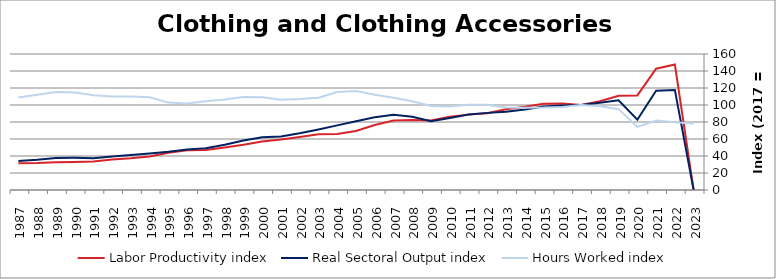
| Category | Labor Productivity index | Real Sectoral Output index | Hours Worked index |
|---|---|---|---|
| 2023.0 | 0 | 0 | 78.307 |
| 2022.0 | 147.592 | 117.741 | 79.774 |
| 2021.0 | 142.694 | 116.682 | 81.77 |
| 2020.0 | 111.298 | 82.657 | 74.267 |
| 2019.0 | 110.901 | 105.49 | 95.12 |
| 2018.0 | 104.315 | 102.765 | 98.514 |
| 2017.0 | 100 | 100 | 100 |
| 2016.0 | 101.866 | 99.522 | 97.7 |
| 2015.0 | 101.373 | 98.264 | 96.934 |
| 2014.0 | 97.892 | 94.781 | 96.822 |
| 2013.0 | 95.005 | 92.103 | 96.945 |
| 2012.0 | 90.392 | 90.735 | 100.379 |
| 2011.0 | 88.678 | 88.872 | 100.218 |
| 2010.0 | 86.266 | 84.789 | 98.288 |
| 2009.0 | 81.845 | 80.944 | 98.898 |
| 2008.0 | 82.485 | 86.153 | 104.447 |
| 2007.0 | 81.676 | 88.634 | 108.519 |
| 2006.0 | 76.404 | 85.61 | 112.05 |
| 2005.0 | 69.511 | 80.983 | 116.504 |
| 2004.0 | 65.93 | 76.01 | 115.288 |
| 2003.0 | 65.638 | 71.279 | 108.594 |
| 2002.0 | 62.429 | 66.79 | 106.986 |
| 2001.0 | 59.365 | 63.066 | 106.235 |
| 2000.0 | 57.006 | 62.158 | 109.038 |
| 1999.0 | 53.322 | 58.324 | 109.381 |
| 1998.0 | 50.03 | 53.291 | 106.519 |
| 1997.0 | 47.077 | 49.127 | 104.354 |
| 1996.0 | 46.826 | 47.691 | 101.849 |
| 1995.0 | 43.732 | 44.965 | 102.819 |
| 1994.0 | 39.462 | 43.069 | 109.14 |
| 1993.0 | 37.372 | 41.088 | 109.944 |
| 1992.0 | 35.866 | 39.439 | 109.96 |
| 1991.0 | 33.565 | 37.451 | 111.578 |
| 1990.0 | 32.957 | 37.797 | 114.687 |
| 1989.0 | 32.693 | 37.662 | 115.2 |
| 1988.0 | 31.748 | 35.603 | 112.143 |
| 1987.0 | 31.369 | 34.098 | 108.702 |